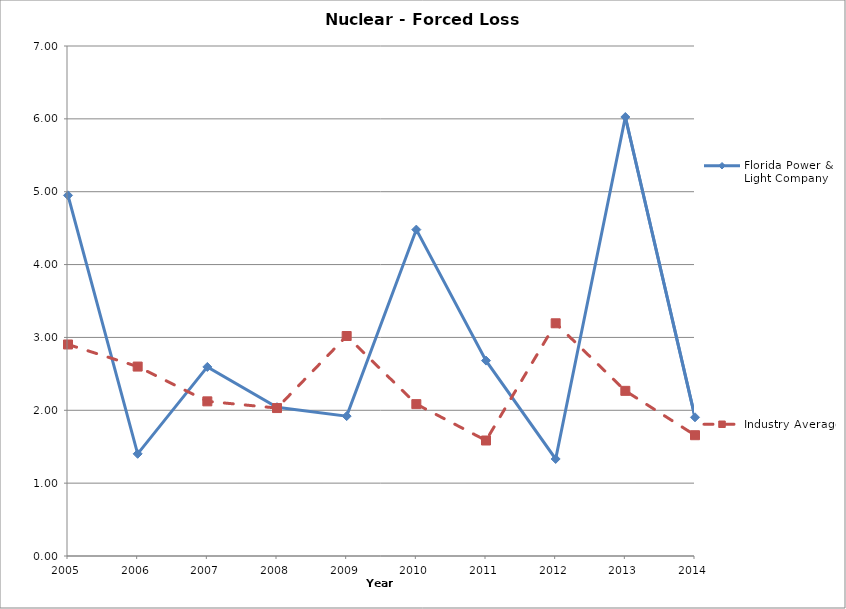
| Category | Florida Power & Light Company | Industry Average |
|---|---|---|
| 2005.0 | 4.95 | 2.903 |
| 2006.0 | 1.403 | 2.6 |
| 2007.0 | 2.595 | 2.123 |
| 2008.0 | 2.043 | 2.031 |
| 2009.0 | 1.92 | 3.02 |
| 2010.0 | 4.48 | 2.084 |
| 2011.0 | 2.682 | 1.585 |
| 2012.0 | 1.332 | 3.194 |
| 2013.0 | 6.025 | 2.267 |
| 2014.0 | 1.904 | 1.658 |